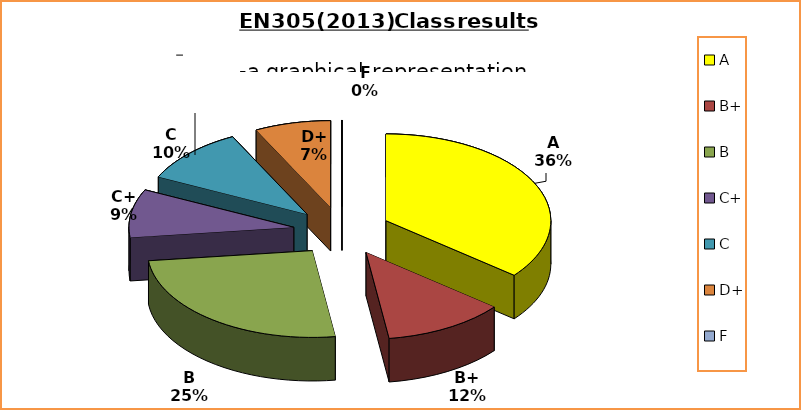
| Category | Series 0 |
|---|---|
| A | 24 |
| B+ | 8 |
| B | 17 |
| C+ | 6 |
| C | 7 |
| D+ | 5 |
| F | 0 |